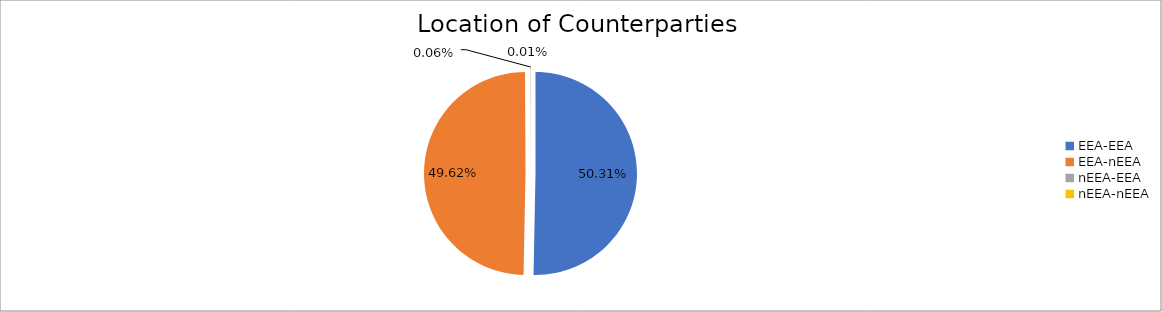
| Category | Series 0 |
|---|---|
| EEA-EEA | 5020844.632 |
| EEA-nEEA | 4952267.361 |
| nEEA-EEA | 5938.785 |
| nEEA-nEEA | 1260.098 |